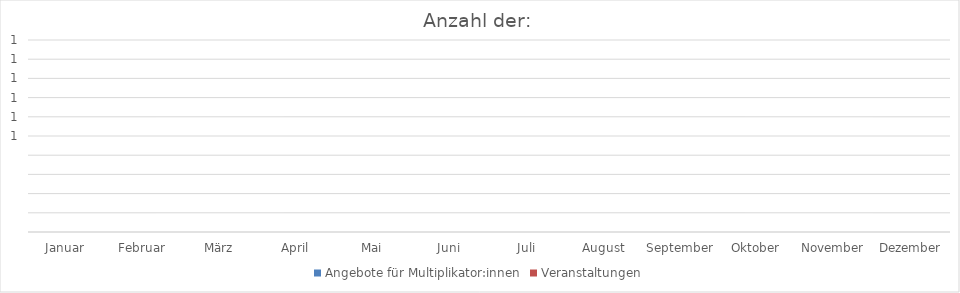
| Category | Angebote für Multiplikator:innen | Veranstaltungen |
|---|---|---|
| Januar | 0 | 0 |
| Februar | 0 | 0 |
| März | 0 | 0 |
| April | 0 | 0 |
| Mai | 0 | 0 |
| Juni | 0 | 0 |
| Juli | 0 | 0 |
| August | 0 | 0 |
| September | 0 | 0 |
| Oktober | 0 | 0 |
| November | 0 | 0 |
| Dezember | 0 | 0 |